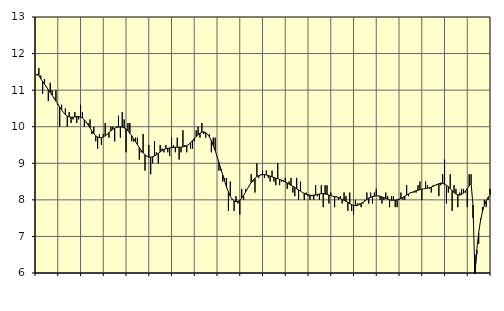
| Category | Piggar | Tillverkning av verkstadsvaror, SNI 25-30, 33 |
|---|---|---|
| nan | 11.4 | 11.44 |
| 1.0 | 11.6 | 11.4 |
| 1.0 | 11.4 | 11.31 |
| 1.0 | 10.9 | 11.24 |
| 1.0 | 11.3 | 11.16 |
| 1.0 | 11.1 | 11.09 |
| 1.0 | 10.7 | 11.01 |
| 1.0 | 11.2 | 10.94 |
| 1.0 | 11 | 10.86 |
| 1.0 | 10.8 | 10.78 |
| 1.0 | 11 | 10.7 |
| 1.0 | 10.6 | 10.62 |
| nan | 10 | 10.54 |
| 2.0 | 10.6 | 10.46 |
| 2.0 | 10.4 | 10.39 |
| 2.0 | 10.5 | 10.33 |
| 2.0 | 10 | 10.29 |
| 2.0 | 10.4 | 10.27 |
| 2.0 | 10.1 | 10.26 |
| 2.0 | 10.2 | 10.26 |
| 2.0 | 10.4 | 10.27 |
| 2.0 | 10.1 | 10.28 |
| 2.0 | 10.2 | 10.28 |
| 2.0 | 10.6 | 10.26 |
| nan | 10.4 | 10.24 |
| 3.0 | 10 | 10.19 |
| 3.0 | 10.1 | 10.13 |
| 3.0 | 10.1 | 10.05 |
| 3.0 | 10.2 | 9.97 |
| 3.0 | 9.8 | 9.88 |
| 3.0 | 10 | 9.81 |
| 3.0 | 9.6 | 9.75 |
| 3.0 | 9.4 | 9.72 |
| 3.0 | 9.8 | 9.7 |
| 3.0 | 9.5 | 9.7 |
| 3.0 | 9.8 | 9.72 |
| nan | 10.1 | 9.75 |
| 4.0 | 9.8 | 9.79 |
| 4.0 | 9.7 | 9.84 |
| 4.0 | 10 | 9.89 |
| 4.0 | 10 | 9.93 |
| 4.0 | 9.6 | 9.96 |
| 4.0 | 10 | 9.98 |
| 4.0 | 10.3 | 9.99 |
| 4.0 | 9.7 | 10 |
| 4.0 | 10.4 | 9.99 |
| 4.0 | 10.2 | 9.97 |
| 4.0 | 9.3 | 9.94 |
| nan | 10.1 | 9.89 |
| 5.0 | 10.1 | 9.82 |
| 5.0 | 9.6 | 9.75 |
| 5.0 | 9.6 | 9.67 |
| 5.0 | 9.7 | 9.59 |
| 5.0 | 9.7 | 9.51 |
| 5.0 | 9.1 | 9.43 |
| 5.0 | 9.3 | 9.35 |
| 5.0 | 9.8 | 9.29 |
| 5.0 | 8.8 | 9.23 |
| 5.0 | 9.2 | 9.19 |
| 5.0 | 9.5 | 9.17 |
| nan | 8.7 | 9.17 |
| 6.0 | 9 | 9.18 |
| 6.0 | 9.6 | 9.2 |
| 6.0 | 9.3 | 9.23 |
| 6.0 | 9 | 9.27 |
| 6.0 | 9.5 | 9.31 |
| 6.0 | 9.4 | 9.35 |
| 6.0 | 9.3 | 9.38 |
| 6.0 | 9.5 | 9.4 |
| 6.0 | 9.3 | 9.41 |
| 6.0 | 9.2 | 9.42 |
| 6.0 | 9.7 | 9.43 |
| nan | 9.5 | 9.43 |
| 7.0 | 9.3 | 9.44 |
| 7.0 | 9.7 | 9.44 |
| 7.0 | 9.1 | 9.44 |
| 7.0 | 9.3 | 9.44 |
| 7.0 | 9.9 | 9.45 |
| 7.0 | 9.5 | 9.46 |
| 7.0 | 9.3 | 9.48 |
| 7.0 | 9.5 | 9.51 |
| 7.0 | 9.4 | 9.56 |
| 7.0 | 9.4 | 9.62 |
| 7.0 | 9.6 | 9.68 |
| nan | 9.9 | 9.73 |
| 8.0 | 10 | 9.78 |
| 8.0 | 9.7 | 9.82 |
| 8.0 | 10.1 | 9.85 |
| 8.0 | 9.8 | 9.86 |
| 8.0 | 9.7 | 9.84 |
| 8.0 | 9.8 | 9.79 |
| 8.0 | 9.8 | 9.72 |
| 8.0 | 9.3 | 9.62 |
| 8.0 | 9.7 | 9.49 |
| 8.0 | 9.7 | 9.35 |
| 8.0 | 9.2 | 9.19 |
| nan | 8.8 | 9.03 |
| 9.0 | 8.8 | 8.85 |
| 9.0 | 8.5 | 8.68 |
| 9.0 | 8.6 | 8.51 |
| 9.0 | 8.6 | 8.35 |
| 9.0 | 7.7 | 8.22 |
| 9.0 | 8.5 | 8.1 |
| 9.0 | 8 | 8.02 |
| 9.0 | 7.7 | 7.97 |
| 9.0 | 8.1 | 7.95 |
| 9.0 | 7.9 | 7.96 |
| 9.0 | 7.6 | 7.99 |
| nan | 8.3 | 8.05 |
| 10.0 | 8 | 8.12 |
| 10.0 | 8.3 | 8.21 |
| 10.0 | 8.3 | 8.3 |
| 10.0 | 8.4 | 8.39 |
| 10.0 | 8.7 | 8.47 |
| 10.0 | 8.5 | 8.54 |
| 10.0 | 8.2 | 8.59 |
| 10.0 | 9 | 8.64 |
| 10.0 | 8.6 | 8.66 |
| 10.0 | 8.7 | 8.68 |
| 10.0 | 8.8 | 8.69 |
| nan | 8.6 | 8.69 |
| 11.0 | 8.8 | 8.68 |
| 11.0 | 8.6 | 8.67 |
| 11.0 | 8.5 | 8.65 |
| 11.0 | 8.8 | 8.63 |
| 11.0 | 8.5 | 8.61 |
| 11.0 | 8.4 | 8.59 |
| 11.0 | 9 | 8.58 |
| 11.0 | 8.4 | 8.56 |
| 11.0 | 8.5 | 8.54 |
| 11.0 | 8.5 | 8.52 |
| 11.0 | 8.6 | 8.49 |
| nan | 8.3 | 8.46 |
| 12.0 | 8.5 | 8.43 |
| 12.0 | 8.6 | 8.4 |
| 12.0 | 8.2 | 8.37 |
| 12.0 | 8.1 | 8.34 |
| 12.0 | 8.6 | 8.3 |
| 12.0 | 8 | 8.27 |
| 12.0 | 8.5 | 8.24 |
| 12.0 | 8.2 | 8.2 |
| 12.0 | 8 | 8.18 |
| 12.0 | 8.2 | 8.15 |
| 12.0 | 8.1 | 8.14 |
| nan | 8 | 8.13 |
| 13.0 | 8.1 | 8.12 |
| 13.0 | 8 | 8.13 |
| 13.0 | 8.4 | 8.13 |
| 13.0 | 8.1 | 8.15 |
| 13.0 | 8 | 8.16 |
| 13.0 | 8.4 | 8.17 |
| 13.0 | 7.8 | 8.17 |
| 13.0 | 8.4 | 8.16 |
| 13.0 | 8.4 | 8.15 |
| 13.0 | 7.9 | 8.13 |
| 13.0 | 8.2 | 8.12 |
| nan | 8.1 | 8.1 |
| 14.0 | 7.8 | 8.09 |
| 14.0 | 8.1 | 8.08 |
| 14.0 | 8 | 8.06 |
| 14.0 | 8.1 | 8.04 |
| 14.0 | 7.9 | 8.01 |
| 14.0 | 8.2 | 7.99 |
| 14.0 | 8.1 | 7.96 |
| 14.0 | 7.7 | 7.93 |
| 14.0 | 8.2 | 7.9 |
| 14.0 | 7.7 | 7.87 |
| 14.0 | 7.6 | 7.85 |
| nan | 8 | 7.84 |
| 15.0 | 7.9 | 7.85 |
| 15.0 | 7.9 | 7.87 |
| 15.0 | 7.8 | 7.9 |
| 15.0 | 7.9 | 7.93 |
| 15.0 | 8 | 7.97 |
| 15.0 | 8.2 | 8.01 |
| 15.0 | 7.9 | 8.05 |
| 15.0 | 8.2 | 8.07 |
| 15.0 | 7.9 | 8.09 |
| 15.0 | 8.2 | 8.1 |
| 15.0 | 8.3 | 8.11 |
| nan | 8.1 | 8.11 |
| 16.0 | 8 | 8.1 |
| 16.0 | 7.9 | 8.08 |
| 16.0 | 8 | 8.06 |
| 16.0 | 8.2 | 8.04 |
| 16.0 | 8.1 | 8.02 |
| 16.0 | 7.8 | 8 |
| 16.0 | 8.1 | 7.99 |
| 16.0 | 8.1 | 7.99 |
| 16.0 | 7.8 | 7.99 |
| 16.0 | 7.8 | 8 |
| 16.0 | 8 | 8.02 |
| nan | 8.2 | 8.04 |
| 17.0 | 8 | 8.07 |
| 17.0 | 8 | 8.1 |
| 17.0 | 8.4 | 8.13 |
| 17.0 | 8.1 | 8.16 |
| 17.0 | 8.2 | 8.19 |
| 17.0 | 8.2 | 8.21 |
| 17.0 | 8.2 | 8.23 |
| 17.0 | 8.2 | 8.25 |
| 17.0 | 8.4 | 8.26 |
| 17.0 | 8.5 | 8.28 |
| 17.0 | 8 | 8.29 |
| nan | 8.3 | 8.3 |
| 18.0 | 8.5 | 8.31 |
| 18.0 | 8.4 | 8.32 |
| 18.0 | 8.3 | 8.33 |
| 18.0 | 8.2 | 8.35 |
| 18.0 | 8.4 | 8.37 |
| 18.0 | 8.4 | 8.4 |
| 18.0 | 8.4 | 8.42 |
| 18.0 | 8.1 | 8.44 |
| 18.0 | 8.4 | 8.46 |
| 18.0 | 8.7 | 8.45 |
| 18.0 | 9.1 | 8.43 |
| nan | 7.9 | 8.4 |
| 19.0 | 8.2 | 8.36 |
| 19.0 | 8.7 | 8.31 |
| 19.0 | 7.7 | 8.25 |
| 19.0 | 8.4 | 8.2 |
| 19.0 | 8.3 | 8.16 |
| 19.0 | 7.8 | 8.14 |
| 19.0 | 8.2 | 8.13 |
| 19.0 | 8.3 | 8.15 |
| 19.0 | 8.3 | 8.19 |
| 19.0 | 8.2 | 8.24 |
| 19.0 | 7.8 | 8.31 |
| nan | 8.7 | 8.38 |
| 20.0 | 8.7 | 8.45 |
| 20.0 | 7.5 | 7.86 |
| 20.0 | 6.5 | 5.98 |
| 20.0 | 6.5 | 6.63 |
| 20.0 | 6.8 | 7.1 |
| 20.0 | 7.5 | 7.44 |
| 20.0 | 7.8 | 7.68 |
| 20.0 | 8 | 7.85 |
| 20.0 | 7.8 | 7.98 |
| 20.0 | 8 | 8.07 |
| 20.0 | 8.3 | 8.14 |